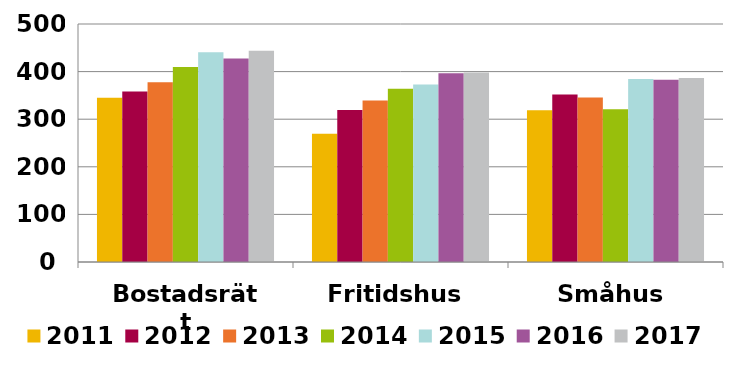
| Category | 2011 | 2012 | 2013 | 2014 | 2015 | 2016 | 2017 |
|---|---|---|---|---|---|---|---|
| Bostadsrätt | 344.874 | 358.348 | 377.738 | 409.77 | 440.479 | 427.38 | 444.061 |
| Fritidshus | 269.223 | 319.488 | 339.353 | 364.164 | 372.829 | 396.499 | 397.858 |
| Småhus | 318.618 | 351.826 | 345.81 | 320.865 | 384.236 | 382.955 | 386.764 |